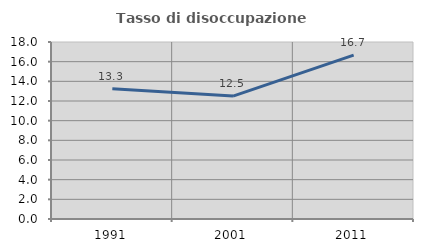
| Category | Tasso di disoccupazione giovanile  |
|---|---|
| 1991.0 | 13.253 |
| 2001.0 | 12.5 |
| 2011.0 | 16.667 |